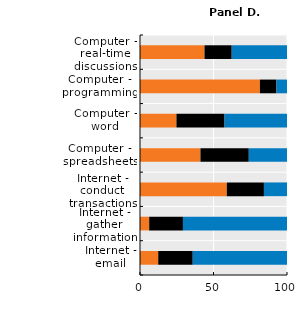
| Category | Never | Less than once a week | At least once a week |
|---|---|---|---|
| Internet - email | 12.396 | 23.477 | 64.127 |
| Internet - gather information | 6.254 | 22.961 | 70.785 |
| Internet - conduct transactions | 59.059 | 25.243 | 15.698 |
| Computer - spreadsheets | 41.126 | 32.881 | 25.993 |
| Computer - word | 24.793 | 32.715 | 42.492 |
| Computer - programming | 81.565 | 11.251 | 7.185 |
| Computer - real-time discussions | 43.875 | 18.521 | 37.604 |